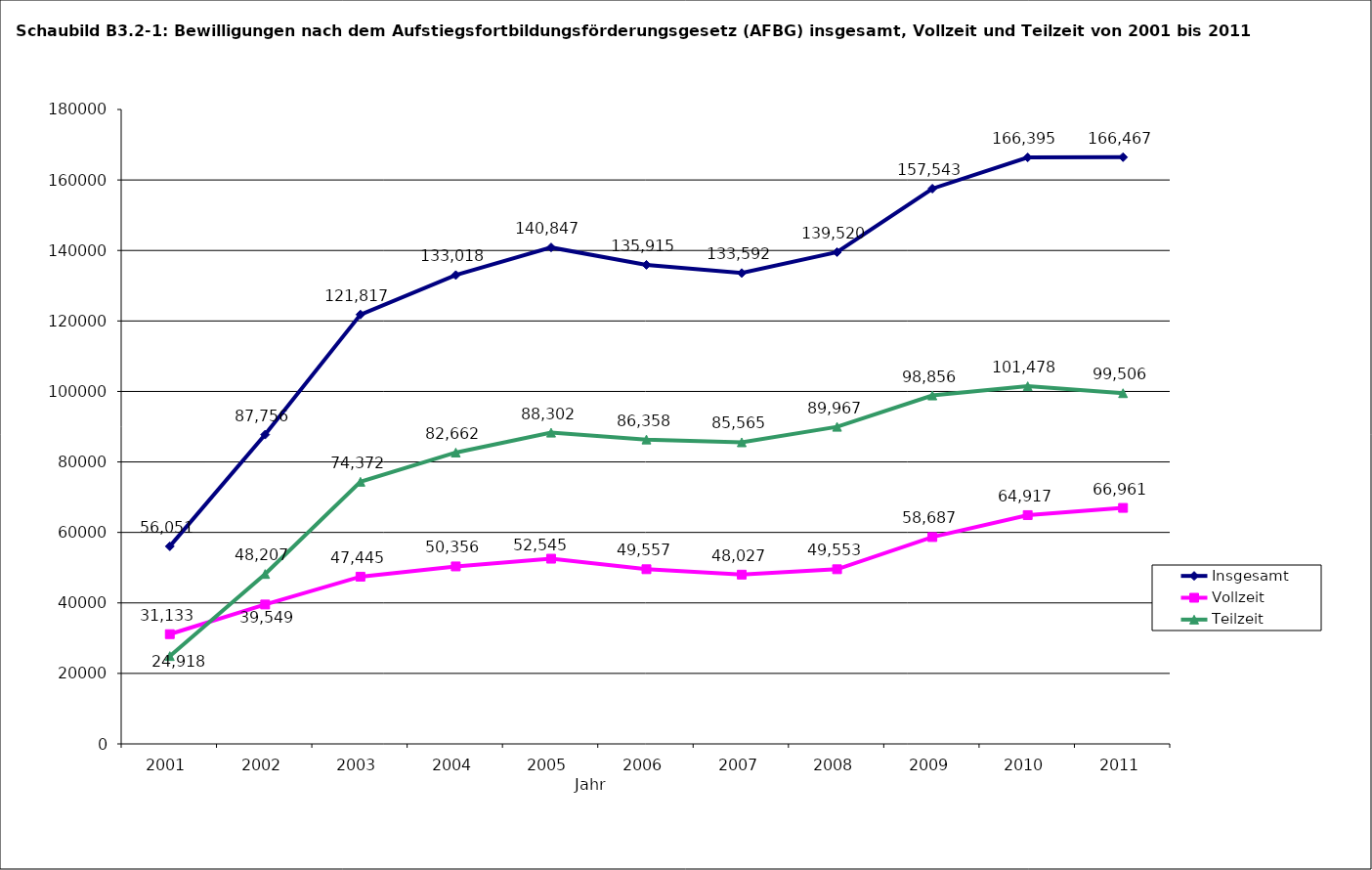
| Category | Insgesamt | Vollzeit | Teilzeit |
|---|---|---|---|
| 2001.0 | 56051 | 31133 | 24918 |
| 2002.0 | 87756 | 39549 | 48207 |
| 2003.0 | 121817 | 47445 | 74372 |
| 2004.0 | 133018 | 50356 | 82662 |
| 2005.0 | 140847 | 52545 | 88302 |
| 2006.0 | 135915 | 49557 | 86358 |
| 2007.0 | 133592 | 48027 | 85565 |
| 2008.0 | 139520 | 49553 | 89967 |
| 2009.0 | 157543 | 58687 | 98856 |
| 2010.0 | 166395 | 64917 | 101478 |
| 2011.0 | 166467 | 66961 | 99506 |